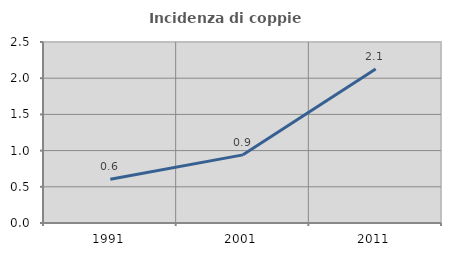
| Category | Incidenza di coppie miste |
|---|---|
| 1991.0 | 0.604 |
| 2001.0 | 0.941 |
| 2011.0 | 2.128 |